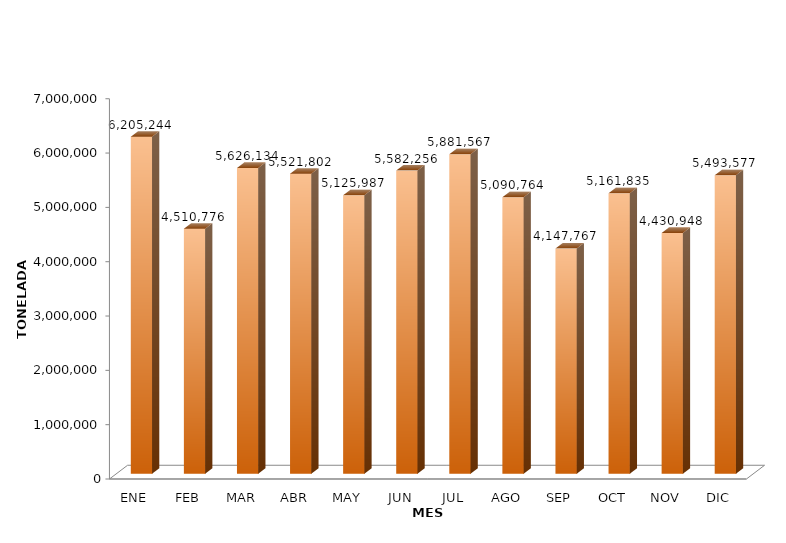
| Category | Series 0 |
|---|---|
| ENE | 6205244.011 |
| FEB | 4510775.64 |
| MAR | 5626134.491 |
| ABR | 5521802.184 |
| MAY | 5125986.772 |
| JUN | 5582256.396 |
| JUL | 5881567.338 |
| AGO | 5090763.715 |
| SEP | 4147766.686 |
| OCT | 5161835.238 |
| NOV | 4430947.808 |
| DIC | 5493577.049 |